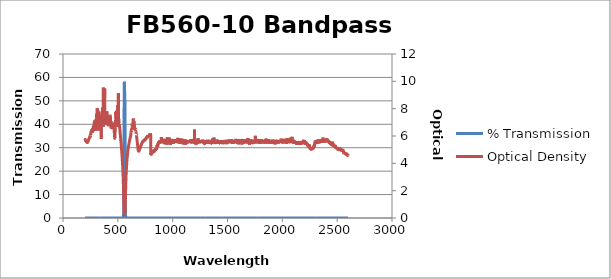
| Category | % Transmission |
|---|---|
| 2600.0 | 0.003 |
| 2599.0 | 0.002 |
| 2598.0 | 0.002 |
| 2597.0 | 0.002 |
| 2596.0 | 0.003 |
| 2595.0 | 0.003 |
| 2594.0 | 0.002 |
| 2593.0 | 0.003 |
| 2592.0 | 0.002 |
| 2591.0 | 0.002 |
| 2590.0 | 0.002 |
| 2589.0 | 0.002 |
| 2588.0 | 0.002 |
| 2587.0 | 0.002 |
| 2586.0 | 0.002 |
| 2585.0 | 0.002 |
| 2584.0 | 0.002 |
| 2583.0 | 0.002 |
| 2582.0 | 0.002 |
| 2581.0 | 0.002 |
| 2580.0 | 0.002 |
| 2579.0 | 0.002 |
| 2578.0 | 0.002 |
| 2577.0 | 0.002 |
| 2576.0 | 0.002 |
| 2575.0 | 0.002 |
| 2574.0 | 0.002 |
| 2573.0 | 0.002 |
| 2572.0 | 0.002 |
| 2571.0 | 0.002 |
| 2570.0 | 0.002 |
| 2569.0 | 0.002 |
| 2568.0 | 0.002 |
| 2567.0 | 0.002 |
| 2566.0 | 0.002 |
| 2565.0 | 0.002 |
| 2564.0 | 0.002 |
| 2563.0 | 0.002 |
| 2562.0 | 0.002 |
| 2561.0 | 0.002 |
| 2560.0 | 0.002 |
| 2559.0 | 0.001 |
| 2558.0 | 0.001 |
| 2557.0 | 0.001 |
| 2556.0 | 0.001 |
| 2555.0 | 0.001 |
| 2554.0 | 0.001 |
| 2553.0 | 0.001 |
| 2552.0 | 0.001 |
| 2551.0 | 0.001 |
| 2550.0 | 0.001 |
| 2549.0 | 0.001 |
| 2548.0 | 0.001 |
| 2547.0 | 0.001 |
| 2546.0 | 0.001 |
| 2545.0 | 0.001 |
| 2544.0 | 0.001 |
| 2543.0 | 0.001 |
| 2542.0 | 0.001 |
| 2541.0 | 0.001 |
| 2540.0 | 0.001 |
| 2539.0 | 0.001 |
| 2538.0 | 0.001 |
| 2537.0 | 0.001 |
| 2536.0 | 0.001 |
| 2535.0 | 0.001 |
| 2534.0 | 0.001 |
| 2533.0 | 0.001 |
| 2532.0 | 0.001 |
| 2531.0 | 0.001 |
| 2530.0 | 0.001 |
| 2529.0 | 0.001 |
| 2528.0 | 0.001 |
| 2527.0 | 0.001 |
| 2526.0 | 0.001 |
| 2525.0 | 0.001 |
| 2524.0 | 0.001 |
| 2523.0 | 0.001 |
| 2522.0 | 0.001 |
| 2521.0 | 0.001 |
| 2520.0 | 0.001 |
| 2519.0 | 0.001 |
| 2518.0 | 0.001 |
| 2517.0 | 0.001 |
| 2516.0 | 0.001 |
| 2515.0 | 0.001 |
| 2514.0 | 0.001 |
| 2513.0 | 0.001 |
| 2512.0 | 0.001 |
| 2511.0 | 0.001 |
| 2510.0 | 0.001 |
| 2509.0 | 0.001 |
| 2508.0 | 0.001 |
| 2507.0 | 0.001 |
| 2506.0 | 0.001 |
| 2505.0 | 0.001 |
| 2504.0 | 0.001 |
| 2503.0 | 0.001 |
| 2502.0 | 0.001 |
| 2501.0 | 0.001 |
| 2500.0 | 0.001 |
| 2499.0 | 0.001 |
| 2498.0 | 0.001 |
| 2497.0 | 0.001 |
| 2496.0 | 0.001 |
| 2495.0 | 0.001 |
| 2494.0 | 0.001 |
| 2493.0 | 0.001 |
| 2492.0 | 0.001 |
| 2491.0 | 0.001 |
| 2490.0 | 0.001 |
| 2489.0 | 0.001 |
| 2488.0 | 0.001 |
| 2487.0 | 0.001 |
| 2486.0 | 0.001 |
| 2485.0 | 0.001 |
| 2484.0 | 0.001 |
| 2483.0 | 0.001 |
| 2482.0 | 0.001 |
| 2481.0 | 0.001 |
| 2480.0 | 0 |
| 2479.0 | 0.001 |
| 2478.0 | 0.001 |
| 2477.0 | 0 |
| 2476.0 | 0.001 |
| 2475.0 | 0.001 |
| 2474.0 | 0.001 |
| 2473.0 | 0.001 |
| 2472.0 | 0.001 |
| 2471.0 | 0.001 |
| 2470.0 | 0.001 |
| 2469.0 | 0.001 |
| 2468.0 | 0 |
| 2467.0 | 0 |
| 2466.0 | 0.001 |
| 2465.0 | 0.001 |
| 2464.0 | 0 |
| 2463.0 | 0.001 |
| 2462.0 | 0.001 |
| 2461.0 | 0 |
| 2460.0 | 0 |
| 2459.0 | 0 |
| 2458.0 | 0 |
| 2457.0 | 0 |
| 2456.0 | 0 |
| 2455.0 | 0 |
| 2454.0 | 0 |
| 2453.0 | 0.001 |
| 2452.0 | 0 |
| 2451.0 | 0 |
| 2450.0 | 0 |
| 2449.0 | 0 |
| 2448.0 | 0 |
| 2447.0 | 0 |
| 2446.0 | 0 |
| 2445.0 | 0 |
| 2444.0 | 0 |
| 2443.0 | 0 |
| 2442.0 | 0 |
| 2441.0 | 0 |
| 2440.0 | 0 |
| 2439.0 | 0 |
| 2438.0 | 0 |
| 2437.0 | 0 |
| 2436.0 | 0 |
| 2435.0 | 0 |
| 2434.0 | 0 |
| 2433.0 | 0 |
| 2432.0 | 0 |
| 2431.0 | 0 |
| 2430.0 | 0 |
| 2429.0 | 0 |
| 2428.0 | 0 |
| 2427.0 | 0 |
| 2426.0 | 0 |
| 2425.0 | 0 |
| 2424.0 | 0 |
| 2423.0 | 0 |
| 2422.0 | 0 |
| 2421.0 | 0 |
| 2420.0 | 0 |
| 2419.0 | 0 |
| 2418.0 | 0 |
| 2417.0 | 0 |
| 2416.0 | 0 |
| 2415.0 | 0 |
| 2414.0 | 0 |
| 2413.0 | 0 |
| 2412.0 | 0 |
| 2411.0 | 0 |
| 2410.0 | 0 |
| 2409.0 | 0 |
| 2408.0 | 0 |
| 2407.0 | 0 |
| 2406.0 | 0 |
| 2405.0 | 0 |
| 2404.0 | 0 |
| 2403.0 | 0 |
| 2402.0 | 0 |
| 2401.0 | 0 |
| 2400.0 | 0 |
| 2399.0 | 0 |
| 2398.0 | 0 |
| 2397.0 | 0 |
| 2396.0 | 0 |
| 2395.0 | 0 |
| 2394.0 | 0 |
| 2393.0 | 0 |
| 2392.0 | 0 |
| 2391.0 | 0 |
| 2390.0 | 0 |
| 2389.0 | 0 |
| 2388.0 | 0 |
| 2387.0 | 0 |
| 2386.0 | 0 |
| 2385.0 | 0 |
| 2384.0 | 0 |
| 2383.0 | 0 |
| 2382.0 | 0 |
| 2381.0 | 0 |
| 2380.0 | 0 |
| 2379.0 | 0 |
| 2378.0 | 0 |
| 2377.0 | 0 |
| 2376.0 | 0 |
| 2375.0 | 0 |
| 2374.0 | 0 |
| 2373.0 | 0 |
| 2372.0 | 0 |
| 2371.0 | 0 |
| 2370.0 | 0 |
| 2369.0 | 0 |
| 2368.0 | 0 |
| 2367.0 | 0 |
| 2366.0 | 0 |
| 2365.0 | 0 |
| 2364.0 | 0 |
| 2363.0 | 0 |
| 2362.0 | 0 |
| 2361.0 | 0 |
| 2360.0 | 0 |
| 2359.0 | 0 |
| 2358.0 | 0 |
| 2357.0 | 0 |
| 2356.0 | 0 |
| 2355.0 | 0 |
| 2354.0 | 0 |
| 2353.0 | 0 |
| 2352.0 | 0 |
| 2351.0 | 0 |
| 2350.0 | 0 |
| 2349.0 | 0 |
| 2348.0 | 0 |
| 2347.0 | 0 |
| 2346.0 | 0 |
| 2345.0 | 0 |
| 2344.0 | 0 |
| 2343.0 | 0 |
| 2342.0 | 0 |
| 2341.0 | 0 |
| 2340.0 | 0 |
| 2339.0 | 0 |
| 2338.0 | 0 |
| 2337.0 | 0 |
| 2336.0 | 0 |
| 2335.0 | 0 |
| 2334.0 | 0 |
| 2333.0 | 0 |
| 2332.0 | 0 |
| 2331.0 | 0 |
| 2330.0 | 0 |
| 2329.0 | 0 |
| 2328.0 | 0 |
| 2327.0 | 0 |
| 2326.0 | 0 |
| 2325.0 | 0 |
| 2324.0 | 0 |
| 2323.0 | 0 |
| 2322.0 | 0 |
| 2321.0 | 0 |
| 2320.0 | 0 |
| 2319.0 | 0 |
| 2318.0 | 0 |
| 2317.0 | 0 |
| 2316.0 | 0 |
| 2315.0 | 0 |
| 2314.0 | 0 |
| 2313.0 | 0 |
| 2312.0 | 0 |
| 2311.0 | 0 |
| 2310.0 | 0 |
| 2309.0 | 0 |
| 2308.0 | 0 |
| 2307.0 | 0 |
| 2306.0 | 0 |
| 2305.0 | 0 |
| 2304.0 | 0 |
| 2303.0 | 0 |
| 2302.0 | 0 |
| 2301.0 | 0 |
| 2300.0 | 0 |
| 2299.0 | 0 |
| 2298.0 | 0 |
| 2297.0 | 0 |
| 2296.0 | 0 |
| 2295.0 | 0 |
| 2294.0 | 0.001 |
| 2293.0 | 0.001 |
| 2292.0 | 0.001 |
| 2291.0 | 0 |
| 2290.0 | 0 |
| 2289.0 | 0.001 |
| 2288.0 | 0.001 |
| 2287.0 | 0.001 |
| 2286.0 | 0.001 |
| 2285.0 | 0.001 |
| 2284.0 | 0.001 |
| 2283.0 | 0.001 |
| 2282.0 | 0.001 |
| 2281.0 | 0.001 |
| 2280.0 | 0.001 |
| 2279.0 | 0.001 |
| 2278.0 | 0.001 |
| 2277.0 | 0.001 |
| 2276.0 | 0.001 |
| 2275.0 | 0.001 |
| 2274.0 | 0.001 |
| 2273.0 | 0.001 |
| 2272.0 | 0.001 |
| 2271.0 | 0.001 |
| 2270.0 | 0.001 |
| 2269.0 | 0.001 |
| 2268.0 | 0.001 |
| 2267.0 | 0.001 |
| 2266.0 | 0.001 |
| 2265.0 | 0.001 |
| 2264.0 | 0.001 |
| 2263.0 | 0.001 |
| 2262.0 | 0.001 |
| 2261.0 | 0.001 |
| 2260.0 | 0.001 |
| 2259.0 | 0.001 |
| 2258.0 | 0.001 |
| 2257.0 | 0.001 |
| 2256.0 | 0.001 |
| 2255.0 | 0.001 |
| 2254.0 | 0.001 |
| 2253.0 | 0.001 |
| 2252.0 | 0.001 |
| 2251.0 | 0.001 |
| 2250.0 | 0.001 |
| 2249.0 | 0.001 |
| 2248.0 | 0.001 |
| 2247.0 | 0 |
| 2246.0 | 0.001 |
| 2245.0 | 0.001 |
| 2244.0 | 0.001 |
| 2243.0 | 0.001 |
| 2242.0 | 0 |
| 2241.0 | 0 |
| 2240.0 | 0.001 |
| 2239.0 | 0.001 |
| 2238.0 | 0.001 |
| 2237.0 | 0.001 |
| 2236.0 | 0.001 |
| 2235.0 | 0.001 |
| 2234.0 | 0 |
| 2233.0 | 0.001 |
| 2232.0 | 0 |
| 2231.0 | 0 |
| 2230.0 | 0 |
| 2229.0 | 0 |
| 2228.0 | 0 |
| 2227.0 | 0 |
| 2226.0 | 0 |
| 2225.0 | 0 |
| 2224.0 | 0 |
| 2223.0 | 0 |
| 2222.0 | 0 |
| 2221.0 | 0 |
| 2220.0 | 0 |
| 2219.0 | 0 |
| 2218.0 | 0 |
| 2217.0 | 0 |
| 2216.0 | 0 |
| 2215.0 | 0 |
| 2214.0 | 0 |
| 2213.0 | 0 |
| 2212.0 | 0 |
| 2211.0 | 0 |
| 2210.0 | 0 |
| 2209.0 | 0 |
| 2208.0 | 0 |
| 2207.0 | 0 |
| 2206.0 | 0 |
| 2205.0 | 0 |
| 2204.0 | 0 |
| 2203.0 | 0 |
| 2202.0 | 0 |
| 2201.0 | 0 |
| 2200.0 | 0 |
| 2199.0 | 0 |
| 2198.0 | 0 |
| 2197.0 | 0 |
| 2196.0 | 0 |
| 2195.0 | 0 |
| 2194.0 | 0 |
| 2193.0 | 0 |
| 2192.0 | 0 |
| 2191.0 | 0 |
| 2190.0 | 0 |
| 2189.0 | 0 |
| 2188.0 | 0 |
| 2187.0 | 0 |
| 2186.0 | 0 |
| 2185.0 | 0 |
| 2184.0 | 0 |
| 2183.0 | 0 |
| 2182.0 | 0 |
| 2181.0 | 0 |
| 2180.0 | 0 |
| 2179.0 | 0 |
| 2178.0 | 0 |
| 2177.0 | 0 |
| 2176.0 | 0 |
| 2175.0 | 0 |
| 2174.0 | 0 |
| 2173.0 | 0 |
| 2172.0 | 0 |
| 2171.0 | 0 |
| 2170.0 | 0 |
| 2169.0 | 0 |
| 2168.0 | 0 |
| 2167.0 | 0 |
| 2166.0 | 0 |
| 2165.0 | 0 |
| 2164.0 | 0 |
| 2163.0 | 0 |
| 2162.0 | 0 |
| 2161.0 | 0 |
| 2160.0 | 0 |
| 2159.0 | 0 |
| 2158.0 | 0 |
| 2157.0 | 0 |
| 2156.0 | 0 |
| 2155.0 | 0 |
| 2154.0 | 0 |
| 2153.0 | 0 |
| 2152.0 | 0 |
| 2151.0 | 0 |
| 2150.0 | 0 |
| 2149.0 | 0 |
| 2148.0 | 0 |
| 2147.0 | 0 |
| 2146.0 | 0 |
| 2145.0 | 0 |
| 2144.0 | 0 |
| 2143.0 | 0 |
| 2142.0 | 0 |
| 2141.0 | 0 |
| 2140.0 | 0 |
| 2139.0 | 0 |
| 2138.0 | 0 |
| 2137.0 | 0 |
| 2136.0 | 0 |
| 2135.0 | 0 |
| 2134.0 | 0 |
| 2133.0 | 0 |
| 2132.0 | 0 |
| 2131.0 | 0 |
| 2130.0 | 0 |
| 2129.0 | 0 |
| 2128.0 | 0 |
| 2127.0 | 0 |
| 2126.0 | 0 |
| 2125.0 | 0 |
| 2124.0 | 0 |
| 2123.0 | 0 |
| 2122.0 | 0 |
| 2121.0 | 0 |
| 2120.0 | 0 |
| 2119.0 | 0 |
| 2118.0 | 0 |
| 2117.0 | 0 |
| 2116.0 | 0 |
| 2115.0 | 0 |
| 2114.0 | 0 |
| 2113.0 | 0 |
| 2112.0 | 0 |
| 2111.0 | 0 |
| 2110.0 | 0 |
| 2109.0 | 0 |
| 2108.0 | 0 |
| 2107.0 | 0 |
| 2106.0 | 0 |
| 2105.0 | 0 |
| 2104.0 | 0 |
| 2103.0 | 0 |
| 2102.0 | 0 |
| 2101.0 | 0 |
| 2100.0 | 0 |
| 2099.0 | 0 |
| 2098.0 | 0 |
| 2097.0 | 0 |
| 2096.0 | 0 |
| 2095.0 | 0 |
| 2094.0 | 0 |
| 2093.0 | 0 |
| 2092.0 | 0 |
| 2091.0 | 0 |
| 2090.0 | 0 |
| 2089.0 | 0 |
| 2088.0 | 0 |
| 2087.0 | 0 |
| 2086.0 | 0 |
| 2085.0 | 0 |
| 2084.0 | 0 |
| 2083.0 | 0 |
| 2082.0 | 0 |
| 2081.0 | 0 |
| 2080.0 | 0 |
| 2079.0 | 0 |
| 2078.0 | 0 |
| 2077.0 | 0 |
| 2076.0 | 0 |
| 2075.0 | 0 |
| 2074.0 | 0 |
| 2073.0 | 0 |
| 2072.0 | 0 |
| 2071.0 | 0 |
| 2070.0 | 0 |
| 2069.0 | 0 |
| 2068.0 | 0 |
| 2067.0 | 0 |
| 2066.0 | 0 |
| 2065.0 | 0 |
| 2064.0 | 0 |
| 2063.0 | 0 |
| 2062.0 | 0 |
| 2061.0 | 0 |
| 2060.0 | 0 |
| 2059.0 | 0 |
| 2058.0 | 0 |
| 2057.0 | 0 |
| 2056.0 | 0 |
| 2055.0 | 0 |
| 2054.0 | 0 |
| 2053.0 | 0 |
| 2052.0 | 0 |
| 2051.0 | 0 |
| 2050.0 | 0 |
| 2049.0 | 0 |
| 2048.0 | 0 |
| 2047.0 | 0 |
| 2046.0 | 0 |
| 2045.0 | 0 |
| 2044.0 | 0 |
| 2043.0 | 0 |
| 2042.0 | 0 |
| 2041.0 | 0 |
| 2040.0 | 0 |
| 2039.0 | 0 |
| 2038.0 | 0 |
| 2037.0 | 0 |
| 2036.0 | 0 |
| 2035.0 | 0 |
| 2034.0 | 0 |
| 2033.0 | 0 |
| 2032.0 | 0 |
| 2031.0 | 0 |
| 2030.0 | 0 |
| 2029.0 | 0 |
| 2028.0 | 0 |
| 2027.0 | 0 |
| 2026.0 | 0 |
| 2025.0 | 0 |
| 2024.0 | 0 |
| 2023.0 | 0 |
| 2022.0 | 0 |
| 2021.0 | 0 |
| 2020.0 | 0 |
| 2019.0 | 0 |
| 2018.0 | 0 |
| 2017.0 | 0 |
| 2016.0 | 0 |
| 2015.0 | 0 |
| 2014.0 | 0 |
| 2013.0 | 0 |
| 2012.0 | 0 |
| 2011.0 | 0 |
| 2010.0 | 0 |
| 2009.0 | 0 |
| 2008.0 | 0 |
| 2007.0 | 0 |
| 2006.0 | 0 |
| 2005.0 | 0 |
| 2004.0 | 0 |
| 2003.0 | 0 |
| 2002.0 | 0 |
| 2001.0 | 0 |
| 2000.0 | 0 |
| 1999.0 | 0 |
| 1998.0 | 0 |
| 1997.0 | 0 |
| 1996.0 | 0 |
| 1995.0 | 0 |
| 1994.0 | 0 |
| 1993.0 | 0 |
| 1992.0 | 0 |
| 1991.0 | 0 |
| 1990.0 | 0 |
| 1989.0 | 0 |
| 1988.0 | 0 |
| 1987.0 | 0 |
| 1986.0 | 0 |
| 1985.0 | 0 |
| 1984.0 | 0 |
| 1983.0 | 0 |
| 1982.0 | 0 |
| 1981.0 | 0 |
| 1980.0 | 0 |
| 1979.0 | 0 |
| 1978.0 | 0 |
| 1977.0 | 0 |
| 1976.0 | 0 |
| 1975.0 | 0 |
| 1974.0 | 0 |
| 1973.0 | 0 |
| 1972.0 | 0 |
| 1971.0 | 0 |
| 1970.0 | 0 |
| 1969.0 | 0 |
| 1968.0 | 0 |
| 1967.0 | 0 |
| 1966.0 | 0 |
| 1965.0 | 0 |
| 1964.0 | 0 |
| 1963.0 | 0 |
| 1962.0 | 0 |
| 1961.0 | 0 |
| 1960.0 | 0 |
| 1959.0 | 0 |
| 1958.0 | 0 |
| 1957.0 | 0 |
| 1956.0 | 0 |
| 1955.0 | 0 |
| 1954.0 | 0 |
| 1953.0 | 0 |
| 1952.0 | 0 |
| 1951.0 | 0 |
| 1950.0 | 0 |
| 1949.0 | 0 |
| 1948.0 | 0 |
| 1947.0 | 0 |
| 1946.0 | 0 |
| 1945.0 | 0 |
| 1944.0 | 0 |
| 1943.0 | 0 |
| 1942.0 | 0 |
| 1941.0 | 0 |
| 1940.0 | 0 |
| 1939.0 | 0 |
| 1938.0 | 0 |
| 1937.0 | 0 |
| 1936.0 | 0 |
| 1935.0 | 0 |
| 1934.0 | 0 |
| 1933.0 | 0 |
| 1932.0 | 0 |
| 1931.0 | 0 |
| 1930.0 | 0 |
| 1929.0 | 0 |
| 1928.0 | 0 |
| 1927.0 | 0 |
| 1926.0 | 0 |
| 1925.0 | 0 |
| 1924.0 | 0 |
| 1923.0 | 0 |
| 1922.0 | 0 |
| 1921.0 | 0 |
| 1920.0 | 0 |
| 1919.0 | 0 |
| 1918.0 | 0 |
| 1917.0 | 0 |
| 1916.0 | 0 |
| 1915.0 | 0 |
| 1914.0 | 0 |
| 1913.0 | 0 |
| 1912.0 | 0 |
| 1911.0 | 0 |
| 1910.0 | 0 |
| 1909.0 | 0 |
| 1908.0 | 0 |
| 1907.0 | 0 |
| 1906.0 | 0 |
| 1905.0 | 0 |
| 1904.0 | 0 |
| 1903.0 | 0 |
| 1902.0 | 0 |
| 1901.0 | 0 |
| 1900.0 | 0 |
| 1899.0 | 0 |
| 1898.0 | 0 |
| 1897.0 | 0 |
| 1896.0 | 0 |
| 1895.0 | 0 |
| 1894.0 | 0 |
| 1893.0 | 0 |
| 1892.0 | 0 |
| 1891.0 | 0 |
| 1890.0 | 0 |
| 1889.0 | 0 |
| 1888.0 | 0 |
| 1887.0 | 0 |
| 1886.0 | 0 |
| 1885.0 | 0 |
| 1884.0 | 0 |
| 1883.0 | 0 |
| 1882.0 | 0 |
| 1881.0 | 0 |
| 1880.0 | 0 |
| 1879.0 | 0 |
| 1878.0 | 0 |
| 1877.0 | 0 |
| 1876.0 | 0 |
| 1875.0 | 0 |
| 1874.0 | 0 |
| 1873.0 | 0 |
| 1872.0 | 0 |
| 1871.0 | 0 |
| 1870.0 | 0 |
| 1869.0 | 0 |
| 1868.0 | 0 |
| 1867.0 | 0 |
| 1866.0 | 0 |
| 1865.0 | 0 |
| 1864.0 | 0 |
| 1863.0 | 0 |
| 1862.0 | 0 |
| 1861.0 | 0 |
| 1860.0 | 0 |
| 1859.0 | 0 |
| 1858.0 | 0 |
| 1857.0 | 0 |
| 1856.0 | 0 |
| 1855.0 | 0 |
| 1854.0 | 0 |
| 1853.0 | 0 |
| 1852.0 | 0 |
| 1851.0 | 0 |
| 1850.0 | 0 |
| 1849.0 | 0 |
| 1848.0 | 0 |
| 1847.0 | 0 |
| 1846.0 | 0 |
| 1845.0 | 0 |
| 1844.0 | 0 |
| 1843.0 | 0 |
| 1842.0 | 0 |
| 1841.0 | 0 |
| 1840.0 | 0 |
| 1839.0 | 0 |
| 1838.0 | 0 |
| 1837.0 | 0 |
| 1836.0 | 0 |
| 1835.0 | 0 |
| 1834.0 | 0 |
| 1833.0 | 0 |
| 1832.0 | 0 |
| 1831.0 | 0 |
| 1830.0 | 0 |
| 1829.0 | 0 |
| 1828.0 | 0 |
| 1827.0 | 0 |
| 1826.0 | 0 |
| 1825.0 | 0 |
| 1824.0 | 0 |
| 1823.0 | 0 |
| 1822.0 | 0 |
| 1821.0 | 0 |
| 1820.0 | 0 |
| 1819.0 | 0 |
| 1818.0 | 0 |
| 1817.0 | 0 |
| 1816.0 | 0 |
| 1815.0 | 0 |
| 1814.0 | 0 |
| 1813.0 | 0 |
| 1812.0 | 0 |
| 1811.0 | 0 |
| 1810.0 | 0 |
| 1809.0 | 0 |
| 1808.0 | 0 |
| 1807.0 | 0 |
| 1806.0 | 0 |
| 1805.0 | 0 |
| 1804.0 | 0 |
| 1803.0 | 0 |
| 1802.0 | 0 |
| 1801.0 | 0 |
| 1800.0 | 0 |
| 1799.0 | 0 |
| 1798.0 | 0 |
| 1797.0 | 0 |
| 1796.0 | 0 |
| 1795.0 | 0 |
| 1794.0 | 0 |
| 1793.0 | 0 |
| 1792.0 | 0 |
| 1791.0 | 0 |
| 1790.0 | 0 |
| 1789.0 | 0 |
| 1788.0 | 0 |
| 1787.0 | 0 |
| 1786.0 | 0 |
| 1785.0 | 0 |
| 1784.0 | 0 |
| 1783.0 | 0 |
| 1782.0 | 0 |
| 1781.0 | 0 |
| 1780.0 | 0 |
| 1779.0 | 0 |
| 1778.0 | 0 |
| 1777.0 | 0 |
| 1776.0 | 0 |
| 1775.0 | 0 |
| 1774.0 | 0 |
| 1773.0 | 0 |
| 1772.0 | 0 |
| 1771.0 | 0 |
| 1770.0 | 0 |
| 1769.0 | 0 |
| 1768.0 | 0 |
| 1767.0 | 0 |
| 1766.0 | 0 |
| 1765.0 | 0 |
| 1764.0 | 0 |
| 1763.0 | 0 |
| 1762.0 | 0 |
| 1761.0 | 0 |
| 1760.0 | 0 |
| 1759.0 | 0 |
| 1758.0 | 0 |
| 1757.0 | 0 |
| 1756.0 | 0 |
| 1755.0 | 0 |
| 1754.0 | 0 |
| 1753.0 | 0 |
| 1752.0 | 0 |
| 1751.0 | 0 |
| 1750.0 | 0 |
| 1749.0 | 0 |
| 1748.0 | 0 |
| 1747.0 | 0 |
| 1746.0 | 0 |
| 1745.0 | 0 |
| 1744.0 | 0 |
| 1743.0 | 0 |
| 1742.0 | 0 |
| 1741.0 | 0 |
| 1740.0 | 0 |
| 1739.0 | 0 |
| 1738.0 | 0 |
| 1737.0 | 0 |
| 1736.0 | 0 |
| 1735.0 | 0 |
| 1734.0 | 0 |
| 1733.0 | 0 |
| 1732.0 | 0 |
| 1731.0 | 0 |
| 1730.0 | 0 |
| 1729.0 | 0 |
| 1728.0 | 0 |
| 1727.0 | 0 |
| 1726.0 | 0 |
| 1725.0 | 0 |
| 1724.0 | 0 |
| 1723.0 | 0 |
| 1722.0 | 0 |
| 1721.0 | 0 |
| 1720.0 | 0 |
| 1719.0 | 0 |
| 1718.0 | 0 |
| 1717.0 | 0 |
| 1716.0 | 0 |
| 1715.0 | 0 |
| 1714.0 | 0 |
| 1713.0 | 0 |
| 1712.0 | 0 |
| 1711.0 | 0 |
| 1710.0 | 0 |
| 1709.0 | 0 |
| 1708.0 | 0 |
| 1707.0 | 0 |
| 1706.0 | 0 |
| 1705.0 | 0 |
| 1704.0 | 0 |
| 1703.0 | 0 |
| 1702.0 | 0 |
| 1701.0 | 0 |
| 1700.0 | 0 |
| 1699.0 | 0 |
| 1698.0 | 0 |
| 1697.0 | 0 |
| 1696.0 | 0 |
| 1695.0 | 0 |
| 1694.0 | 0 |
| 1693.0 | 0 |
| 1692.0 | 0 |
| 1691.0 | 0 |
| 1690.0 | 0 |
| 1689.0 | 0 |
| 1688.0 | 0 |
| 1687.0 | 0 |
| 1686.0 | 0 |
| 1685.0 | 0 |
| 1684.0 | 0 |
| 1683.0 | 0 |
| 1682.0 | 0 |
| 1681.0 | 0 |
| 1680.0 | 0 |
| 1679.0 | 0 |
| 1678.0 | 0 |
| 1677.0 | 0 |
| 1676.0 | 0 |
| 1675.0 | 0 |
| 1674.0 | 0 |
| 1673.0 | 0 |
| 1672.0 | 0 |
| 1671.0 | 0 |
| 1670.0 | 0 |
| 1669.0 | 0 |
| 1668.0 | 0 |
| 1667.0 | 0 |
| 1666.0 | 0 |
| 1665.0 | 0 |
| 1664.0 | 0 |
| 1663.0 | 0 |
| 1662.0 | 0 |
| 1661.0 | 0 |
| 1660.0 | 0 |
| 1659.0 | 0 |
| 1658.0 | 0 |
| 1657.0 | 0 |
| 1656.0 | 0 |
| 1655.0 | 0 |
| 1654.0 | 0 |
| 1653.0 | 0 |
| 1652.0 | 0 |
| 1651.0 | 0 |
| 1650.0 | 0 |
| 1649.0 | 0 |
| 1648.0 | 0 |
| 1647.0 | 0 |
| 1646.0 | 0 |
| 1645.0 | 0 |
| 1644.0 | 0 |
| 1643.0 | 0 |
| 1642.0 | 0 |
| 1641.0 | 0 |
| 1640.0 | 0 |
| 1639.0 | 0 |
| 1638.0 | 0 |
| 1637.0 | 0 |
| 1636.0 | 0 |
| 1635.0 | 0 |
| 1634.0 | 0 |
| 1633.0 | 0 |
| 1632.0 | 0 |
| 1631.0 | 0 |
| 1630.0 | 0 |
| 1629.0 | 0 |
| 1628.0 | 0 |
| 1627.0 | 0 |
| 1626.0 | 0 |
| 1625.0 | 0 |
| 1624.0 | 0 |
| 1623.0 | 0 |
| 1622.0 | 0 |
| 1621.0 | 0 |
| 1620.0 | 0 |
| 1619.0 | 0 |
| 1618.0 | 0 |
| 1617.0 | 0 |
| 1616.0 | 0 |
| 1615.0 | 0 |
| 1614.0 | 0 |
| 1613.0 | 0 |
| 1612.0 | 0 |
| 1611.0 | 0 |
| 1610.0 | 0 |
| 1609.0 | 0 |
| 1608.0 | 0 |
| 1607.0 | 0 |
| 1606.0 | 0 |
| 1605.0 | 0 |
| 1604.0 | 0 |
| 1603.0 | 0 |
| 1602.0 | 0 |
| 1601.0 | 0 |
| 1600.0 | 0 |
| 1599.0 | 0 |
| 1598.0 | 0 |
| 1597.0 | 0 |
| 1596.0 | 0 |
| 1595.0 | 0 |
| 1594.0 | 0 |
| 1593.0 | 0 |
| 1592.0 | 0 |
| 1591.0 | 0 |
| 1590.0 | 0 |
| 1589.0 | 0 |
| 1588.0 | 0 |
| 1587.0 | 0 |
| 1586.0 | 0 |
| 1585.0 | 0 |
| 1584.0 | 0 |
| 1583.0 | 0 |
| 1582.0 | 0 |
| 1581.0 | 0 |
| 1580.0 | 0 |
| 1579.0 | 0 |
| 1578.0 | 0 |
| 1577.0 | 0 |
| 1576.0 | 0 |
| 1575.0 | 0 |
| 1574.0 | 0 |
| 1573.0 | 0 |
| 1572.0 | 0 |
| 1571.0 | 0 |
| 1570.0 | 0 |
| 1569.0 | 0 |
| 1568.0 | 0 |
| 1567.0 | 0 |
| 1566.0 | 0 |
| 1565.0 | 0 |
| 1564.0 | 0 |
| 1563.0 | 0 |
| 1562.0 | 0 |
| 1561.0 | 0 |
| 1560.0 | 0 |
| 1559.0 | 0 |
| 1558.0 | 0 |
| 1557.0 | 0 |
| 1556.0 | 0 |
| 1555.0 | 0 |
| 1554.0 | 0 |
| 1553.0 | 0 |
| 1552.0 | 0 |
| 1551.0 | 0 |
| 1550.0 | 0 |
| 1549.0 | 0 |
| 1548.0 | 0 |
| 1547.0 | 0 |
| 1546.0 | 0 |
| 1545.0 | 0 |
| 1544.0 | 0 |
| 1543.0 | 0 |
| 1542.0 | 0 |
| 1541.0 | 0 |
| 1540.0 | 0 |
| 1539.0 | 0 |
| 1538.0 | 0 |
| 1537.0 | 0 |
| 1536.0 | 0 |
| 1535.0 | 0 |
| 1534.0 | 0 |
| 1533.0 | 0 |
| 1532.0 | 0 |
| 1531.0 | 0 |
| 1530.0 | 0 |
| 1529.0 | 0 |
| 1528.0 | 0 |
| 1527.0 | 0 |
| 1526.0 | 0 |
| 1525.0 | 0 |
| 1524.0 | 0 |
| 1523.0 | 0 |
| 1522.0 | 0 |
| 1521.0 | 0 |
| 1520.0 | 0 |
| 1519.0 | 0 |
| 1518.0 | 0 |
| 1517.0 | 0 |
| 1516.0 | 0 |
| 1515.0 | 0 |
| 1514.0 | 0 |
| 1513.0 | 0 |
| 1512.0 | 0 |
| 1511.0 | 0 |
| 1510.0 | 0 |
| 1509.0 | 0 |
| 1508.0 | 0 |
| 1507.0 | 0 |
| 1506.0 | 0 |
| 1505.0 | 0 |
| 1504.0 | 0 |
| 1503.0 | 0 |
| 1502.0 | 0 |
| 1501.0 | 0 |
| 1500.0 | 0 |
| 1499.0 | 0 |
| 1498.0 | 0 |
| 1497.0 | 0 |
| 1496.0 | 0 |
| 1495.0 | 0 |
| 1494.0 | 0 |
| 1493.0 | 0 |
| 1492.0 | 0 |
| 1491.0 | 0 |
| 1490.0 | 0 |
| 1489.0 | 0 |
| 1488.0 | 0 |
| 1487.0 | 0 |
| 1486.0 | 0 |
| 1485.0 | 0 |
| 1484.0 | 0 |
| 1483.0 | 0 |
| 1482.0 | 0 |
| 1481.0 | 0 |
| 1480.0 | 0 |
| 1479.0 | 0 |
| 1478.0 | 0 |
| 1477.0 | 0 |
| 1476.0 | 0 |
| 1475.0 | 0 |
| 1474.0 | 0 |
| 1473.0 | 0 |
| 1472.0 | 0 |
| 1471.0 | 0 |
| 1470.0 | 0 |
| 1469.0 | 0 |
| 1468.0 | 0 |
| 1467.0 | 0 |
| 1466.0 | 0 |
| 1465.0 | 0 |
| 1464.0 | 0 |
| 1463.0 | 0 |
| 1462.0 | 0 |
| 1461.0 | 0 |
| 1460.0 | 0 |
| 1459.0 | 0 |
| 1458.0 | 0 |
| 1457.0 | 0 |
| 1456.0 | 0 |
| 1455.0 | 0 |
| 1454.0 | 0 |
| 1453.0 | 0 |
| 1452.0 | 0 |
| 1451.0 | 0 |
| 1450.0 | 0 |
| 1449.0 | 0 |
| 1448.0 | 0 |
| 1447.0 | 0 |
| 1446.0 | 0 |
| 1445.0 | 0 |
| 1444.0 | 0 |
| 1443.0 | 0 |
| 1442.0 | 0 |
| 1441.0 | 0 |
| 1440.0 | 0 |
| 1439.0 | 0 |
| 1438.0 | 0 |
| 1437.0 | 0 |
| 1436.0 | 0 |
| 1435.0 | 0 |
| 1434.0 | 0 |
| 1433.0 | 0 |
| 1432.0 | 0 |
| 1431.0 | 0 |
| 1430.0 | 0 |
| 1429.0 | 0 |
| 1428.0 | 0 |
| 1427.0 | 0 |
| 1426.0 | 0 |
| 1425.0 | 0 |
| 1424.0 | 0 |
| 1423.0 | 0 |
| 1422.0 | 0 |
| 1421.0 | 0 |
| 1420.0 | 0 |
| 1419.0 | 0 |
| 1418.0 | 0 |
| 1417.0 | 0 |
| 1416.0 | 0 |
| 1415.0 | 0 |
| 1414.0 | 0 |
| 1413.0 | 0 |
| 1412.0 | 0 |
| 1411.0 | 0 |
| 1410.0 | 0 |
| 1409.0 | 0 |
| 1408.0 | 0 |
| 1407.0 | 0 |
| 1406.0 | 0 |
| 1405.0 | 0 |
| 1404.0 | 0 |
| 1403.0 | 0 |
| 1402.0 | 0 |
| 1401.0 | 0 |
| 1400.0 | 0 |
| 1399.0 | 0 |
| 1398.0 | 0 |
| 1397.0 | 0 |
| 1396.0 | 0 |
| 1395.0 | 0 |
| 1394.0 | 0 |
| 1393.0 | 0 |
| 1392.0 | 0 |
| 1391.0 | 0 |
| 1390.0 | 0 |
| 1389.0 | 0 |
| 1388.0 | 0 |
| 1387.0 | 0 |
| 1386.0 | 0 |
| 1385.0 | 0 |
| 1384.0 | 0 |
| 1383.0 | 0 |
| 1382.0 | 0 |
| 1381.0 | 0 |
| 1380.0 | 0 |
| 1379.0 | 0 |
| 1378.0 | 0 |
| 1377.0 | 0 |
| 1376.0 | 0 |
| 1375.0 | 0 |
| 1374.0 | 0 |
| 1373.0 | 0 |
| 1372.0 | 0 |
| 1371.0 | 0 |
| 1370.0 | 0 |
| 1369.0 | 0 |
| 1368.0 | 0 |
| 1367.0 | 0 |
| 1366.0 | 0 |
| 1365.0 | 0 |
| 1364.0 | 0 |
| 1363.0 | 0 |
| 1362.0 | 0 |
| 1361.0 | 0 |
| 1360.0 | 0 |
| 1359.0 | 0 |
| 1358.0 | 0 |
| 1357.0 | 0 |
| 1356.0 | 0 |
| 1355.0 | 0 |
| 1354.0 | 0 |
| 1353.0 | 0 |
| 1352.0 | 0 |
| 1351.0 | 0 |
| 1350.0 | 0 |
| 1349.0 | 0 |
| 1348.0 | 0 |
| 1347.0 | 0 |
| 1346.0 | 0 |
| 1345.0 | 0 |
| 1344.0 | 0 |
| 1343.0 | 0 |
| 1342.0 | 0 |
| 1341.0 | 0 |
| 1340.0 | 0 |
| 1339.0 | 0 |
| 1338.0 | 0 |
| 1337.0 | 0 |
| 1336.0 | 0 |
| 1335.0 | 0 |
| 1334.0 | 0 |
| 1333.0 | 0 |
| 1332.0 | 0 |
| 1331.0 | 0 |
| 1330.0 | 0 |
| 1329.0 | 0 |
| 1328.0 | 0 |
| 1327.0 | 0 |
| 1326.0 | 0 |
| 1325.0 | 0 |
| 1324.0 | 0 |
| 1323.0 | 0 |
| 1322.0 | 0 |
| 1321.0 | 0 |
| 1320.0 | 0 |
| 1319.0 | 0 |
| 1318.0 | 0 |
| 1317.0 | 0 |
| 1316.0 | 0 |
| 1315.0 | 0 |
| 1314.0 | 0 |
| 1313.0 | 0 |
| 1312.0 | 0 |
| 1311.0 | 0 |
| 1310.0 | 0 |
| 1309.0 | 0 |
| 1308.0 | 0 |
| 1307.0 | 0 |
| 1306.0 | 0 |
| 1305.0 | 0 |
| 1304.0 | 0 |
| 1303.0 | 0 |
| 1302.0 | 0 |
| 1301.0 | 0 |
| 1300.0 | 0 |
| 1299.0 | 0 |
| 1298.0 | 0 |
| 1297.0 | 0 |
| 1296.0 | 0 |
| 1295.0 | 0 |
| 1294.0 | 0 |
| 1293.0 | 0 |
| 1292.0 | 0 |
| 1291.0 | 0 |
| 1290.0 | 0 |
| 1289.0 | 0 |
| 1288.0 | 0 |
| 1287.0 | 0 |
| 1286.0 | 0 |
| 1285.0 | 0 |
| 1284.0 | 0 |
| 1283.0 | 0 |
| 1282.0 | 0 |
| 1281.0 | 0 |
| 1280.0 | 0 |
| 1279.0 | 0 |
| 1278.0 | 0 |
| 1277.0 | 0 |
| 1276.0 | 0 |
| 1275.0 | 0 |
| 1274.0 | 0 |
| 1273.0 | 0 |
| 1272.0 | 0 |
| 1271.0 | 0 |
| 1270.0 | 0 |
| 1269.0 | 0 |
| 1268.0 | 0 |
| 1267.0 | 0 |
| 1266.0 | 0 |
| 1265.0 | 0 |
| 1264.0 | 0 |
| 1263.0 | 0 |
| 1262.0 | 0 |
| 1261.0 | 0 |
| 1260.0 | 0 |
| 1259.0 | 0 |
| 1258.0 | 0 |
| 1257.0 | 0 |
| 1256.0 | 0 |
| 1255.0 | 0 |
| 1254.0 | 0 |
| 1253.0 | 0 |
| 1252.0 | 0 |
| 1251.0 | 0 |
| 1250.0 | 0 |
| 1249.0 | 0 |
| 1248.0 | 0 |
| 1247.0 | 0 |
| 1246.0 | 0 |
| 1245.0 | 0 |
| 1244.0 | 0 |
| 1243.0 | 0 |
| 1242.0 | 0 |
| 1241.0 | 0 |
| 1240.0 | 0 |
| 1239.0 | 0 |
| 1238.0 | 0 |
| 1237.0 | 0 |
| 1236.0 | 0 |
| 1235.0 | 0 |
| 1234.0 | 0 |
| 1233.0 | 0 |
| 1232.0 | 0 |
| 1231.0 | 0 |
| 1230.0 | 0 |
| 1229.0 | 0 |
| 1228.0 | 0 |
| 1227.0 | 0 |
| 1226.0 | 0 |
| 1225.0 | 0 |
| 1224.0 | 0 |
| 1223.0 | 0 |
| 1222.0 | 0 |
| 1221.0 | 0 |
| 1220.0 | 0 |
| 1219.0 | 0 |
| 1218.0 | 0 |
| 1217.0 | 0 |
| 1216.0 | 0 |
| 1215.0 | 0 |
| 1214.0 | 0 |
| 1213.0 | 0 |
| 1212.0 | 0 |
| 1211.0 | 0 |
| 1210.0 | 0 |
| 1209.0 | 0 |
| 1208.0 | 0 |
| 1207.0 | 0 |
| 1206.0 | 0 |
| 1205.0 | 0 |
| 1204.0 | 0 |
| 1203.0 | 0 |
| 1202.0 | 0 |
| 1201.0 | 0 |
| 1200.0 | 0 |
| 1199.0 | 0 |
| 1198.0 | 0 |
| 1197.0 | 0 |
| 1196.0 | 0 |
| 1195.0 | 0 |
| 1194.0 | 0 |
| 1193.0 | 0 |
| 1192.0 | 0 |
| 1191.0 | 0 |
| 1190.0 | 0 |
| 1189.0 | 0 |
| 1188.0 | 0 |
| 1187.0 | 0 |
| 1186.0 | 0 |
| 1185.0 | 0 |
| 1184.0 | 0 |
| 1183.0 | 0 |
| 1182.0 | 0 |
| 1181.0 | 0 |
| 1180.0 | 0 |
| 1179.0 | 0 |
| 1178.0 | 0 |
| 1177.0 | 0 |
| 1176.0 | 0 |
| 1175.0 | 0 |
| 1174.0 | 0 |
| 1173.0 | 0 |
| 1172.0 | 0 |
| 1171.0 | 0 |
| 1170.0 | 0 |
| 1169.0 | 0 |
| 1168.0 | 0 |
| 1167.0 | 0 |
| 1166.0 | 0 |
| 1165.0 | 0 |
| 1164.0 | 0 |
| 1163.0 | 0 |
| 1162.0 | 0 |
| 1161.0 | 0 |
| 1160.0 | 0 |
| 1159.0 | 0 |
| 1158.0 | 0 |
| 1157.0 | 0 |
| 1156.0 | 0 |
| 1155.0 | 0 |
| 1154.0 | 0 |
| 1153.0 | 0 |
| 1152.0 | 0 |
| 1151.0 | 0 |
| 1150.0 | 0 |
| 1149.0 | 0 |
| 1148.0 | 0 |
| 1147.0 | 0 |
| 1146.0 | 0 |
| 1145.0 | 0 |
| 1144.0 | 0 |
| 1143.0 | 0 |
| 1142.0 | 0 |
| 1141.0 | 0 |
| 1140.0 | 0 |
| 1139.0 | 0 |
| 1138.0 | 0 |
| 1137.0 | 0 |
| 1136.0 | 0 |
| 1135.0 | 0 |
| 1134.0 | 0 |
| 1133.0 | 0 |
| 1132.0 | 0 |
| 1131.0 | 0 |
| 1130.0 | 0 |
| 1129.0 | 0 |
| 1128.0 | 0 |
| 1127.0 | 0 |
| 1126.0 | 0 |
| 1125.0 | 0 |
| 1124.0 | 0 |
| 1123.0 | 0 |
| 1122.0 | 0 |
| 1121.0 | 0 |
| 1120.0 | 0 |
| 1119.0 | 0 |
| 1118.0 | 0 |
| 1117.0 | 0 |
| 1116.0 | 0 |
| 1115.0 | 0 |
| 1114.0 | 0 |
| 1113.0 | 0 |
| 1112.0 | 0 |
| 1111.0 | 0 |
| 1110.0 | 0 |
| 1109.0 | 0 |
| 1108.0 | 0 |
| 1107.0 | 0 |
| 1106.0 | 0 |
| 1105.0 | 0 |
| 1104.0 | 0 |
| 1103.0 | 0 |
| 1102.0 | 0 |
| 1101.0 | 0 |
| 1100.0 | 0 |
| 1099.0 | 0 |
| 1098.0 | 0 |
| 1097.0 | 0 |
| 1096.0 | 0 |
| 1095.0 | 0 |
| 1094.0 | 0 |
| 1093.0 | 0 |
| 1092.0 | 0 |
| 1091.0 | 0 |
| 1090.0 | 0 |
| 1089.0 | 0 |
| 1088.0 | 0 |
| 1087.0 | 0 |
| 1086.0 | 0 |
| 1085.0 | 0 |
| 1084.0 | 0 |
| 1083.0 | 0 |
| 1082.0 | 0 |
| 1081.0 | 0 |
| 1080.0 | 0 |
| 1079.0 | 0 |
| 1078.0 | 0 |
| 1077.0 | 0 |
| 1076.0 | 0 |
| 1075.0 | 0 |
| 1074.0 | 0 |
| 1073.0 | 0 |
| 1072.0 | 0 |
| 1071.0 | 0 |
| 1070.0 | 0 |
| 1069.0 | 0 |
| 1068.0 | 0 |
| 1067.0 | 0 |
| 1066.0 | 0 |
| 1065.0 | 0 |
| 1064.0 | 0 |
| 1063.0 | 0 |
| 1062.0 | 0 |
| 1061.0 | 0 |
| 1060.0 | 0 |
| 1059.0 | 0 |
| 1058.0 | 0 |
| 1057.0 | 0 |
| 1056.0 | 0 |
| 1055.0 | 0 |
| 1054.0 | 0 |
| 1053.0 | 0 |
| 1052.0 | 0 |
| 1051.0 | 0 |
| 1050.0 | 0 |
| 1049.0 | 0 |
| 1048.0 | 0 |
| 1047.0 | 0 |
| 1046.0 | 0 |
| 1045.0 | 0 |
| 1044.0 | 0 |
| 1043.0 | 0 |
| 1042.0 | 0 |
| 1041.0 | 0 |
| 1040.0 | 0 |
| 1039.0 | 0 |
| 1038.0 | 0 |
| 1037.0 | 0 |
| 1036.0 | 0 |
| 1035.0 | 0 |
| 1034.0 | 0 |
| 1033.0 | 0 |
| 1032.0 | 0 |
| 1031.0 | 0 |
| 1030.0 | 0 |
| 1029.0 | 0 |
| 1028.0 | 0 |
| 1027.0 | 0 |
| 1026.0 | 0 |
| 1025.0 | 0 |
| 1024.0 | 0 |
| 1023.0 | 0 |
| 1022.0 | 0 |
| 1021.0 | 0 |
| 1020.0 | 0 |
| 1019.0 | 0 |
| 1018.0 | 0 |
| 1017.0 | 0 |
| 1016.0 | 0 |
| 1015.0 | 0 |
| 1014.0 | 0 |
| 1013.0 | 0 |
| 1012.0 | 0 |
| 1011.0 | 0 |
| 1010.0 | 0 |
| 1009.0 | 0 |
| 1008.0 | 0 |
| 1007.0 | 0 |
| 1006.0 | 0 |
| 1005.0 | 0 |
| 1004.0 | 0 |
| 1003.0 | 0 |
| 1002.0 | 0 |
| 1001.0 | 0 |
| 1000.0 | 0 |
| 999.0 | 0 |
| 998.0 | 0 |
| 997.0 | 0 |
| 996.0 | 0 |
| 995.0 | 0 |
| 994.0 | 0 |
| 993.0 | 0 |
| 992.0 | 0 |
| 991.0 | 0 |
| 990.0 | 0 |
| 989.0 | 0 |
| 988.0 | 0 |
| 987.0 | 0 |
| 986.0 | 0 |
| 985.0 | 0 |
| 984.0 | 0 |
| 983.0 | 0 |
| 982.0 | 0 |
| 981.0 | 0 |
| 980.0 | 0 |
| 979.0 | 0 |
| 978.0 | 0 |
| 977.0 | 0 |
| 976.0 | 0 |
| 975.0 | 0 |
| 974.0 | 0 |
| 973.0 | 0 |
| 972.0 | 0 |
| 971.0 | 0 |
| 970.0 | 0 |
| 969.0 | 0 |
| 968.0 | 0 |
| 967.0 | 0 |
| 966.0 | 0 |
| 965.0 | 0 |
| 964.0 | 0 |
| 963.0 | 0 |
| 962.0 | 0 |
| 961.0 | 0 |
| 960.0 | 0 |
| 959.0 | 0 |
| 958.0 | 0 |
| 957.0 | 0 |
| 956.0 | 0 |
| 955.0 | 0 |
| 954.0 | 0 |
| 953.0 | 0 |
| 952.0 | 0 |
| 951.0 | 0 |
| 950.0 | 0 |
| 949.0 | 0 |
| 948.0 | 0 |
| 947.0 | 0 |
| 946.0 | 0 |
| 945.0 | 0 |
| 944.0 | 0 |
| 943.0 | 0 |
| 942.0 | 0 |
| 941.0 | 0 |
| 940.0 | 0 |
| 939.0 | 0 |
| 938.0 | 0 |
| 937.0 | 0 |
| 936.0 | 0 |
| 935.0 | 0 |
| 934.0 | 0 |
| 933.0 | 0 |
| 932.0 | 0 |
| 931.0 | 0 |
| 930.0 | 0 |
| 929.0 | 0 |
| 928.0 | 0 |
| 927.0 | 0 |
| 926.0 | 0 |
| 925.0 | 0 |
| 924.0 | 0 |
| 923.0 | 0 |
| 922.0 | 0 |
| 921.0 | 0 |
| 920.0 | 0 |
| 919.0 | 0 |
| 918.0 | 0 |
| 917.0 | 0 |
| 916.0 | 0 |
| 915.0 | 0 |
| 914.0 | 0 |
| 913.0 | 0 |
| 912.0 | 0 |
| 911.0 | 0 |
| 910.0 | 0 |
| 909.0 | 0 |
| 908.0 | 0 |
| 907.0 | 0 |
| 906.0 | 0 |
| 905.0 | 0 |
| 904.0 | 0 |
| 903.0 | 0 |
| 902.0 | 0 |
| 901.0 | 0 |
| 900.0 | 0 |
| 899.0 | 0 |
| 898.0 | 0 |
| 897.0 | 0 |
| 896.0 | 0 |
| 895.0 | 0 |
| 894.0 | 0 |
| 893.0 | 0 |
| 892.0 | 0 |
| 891.0 | 0 |
| 890.0 | 0 |
| 889.0 | 0 |
| 888.0 | 0 |
| 887.0 | 0 |
| 886.0 | 0 |
| 885.0 | 0 |
| 884.0 | 0 |
| 883.0 | 0 |
| 882.0 | 0 |
| 881.0 | 0 |
| 880.0 | 0 |
| 879.0 | 0 |
| 878.0 | 0 |
| 877.0 | 0 |
| 876.0 | 0 |
| 875.0 | 0 |
| 874.0 | 0 |
| 873.0 | 0 |
| 872.0 | 0 |
| 871.0 | 0 |
| 870.0 | 0 |
| 869.0 | 0 |
| 868.0 | 0 |
| 867.0 | 0 |
| 866.0 | 0 |
| 865.0 | 0 |
| 864.0 | 0.001 |
| 863.0 | 0 |
| 862.0 | 0 |
| 861.0 | 0 |
| 860.0 | 0.001 |
| 859.0 | 0.001 |
| 858.0 | 0 |
| 857.0 | 0.001 |
| 856.0 | 0.001 |
| 855.0 | 0.001 |
| 854.0 | 0.001 |
| 853.0 | 0.001 |
| 852.0 | 0.001 |
| 851.0 | 0.001 |
| 850.0 | 0.001 |
| 849.0 | 0.001 |
| 848.0 | 0.001 |
| 847.0 | 0.001 |
| 846.0 | 0.001 |
| 845.0 | 0.001 |
| 844.0 | 0.001 |
| 843.0 | 0.001 |
| 842.0 | 0.001 |
| 841.0 | 0.001 |
| 840.0 | 0.001 |
| 839.0 | 0.001 |
| 838.0 | 0.001 |
| 837.0 | 0.001 |
| 836.0 | 0.001 |
| 835.0 | 0.001 |
| 834.0 | 0.001 |
| 833.0 | 0.001 |
| 832.0 | 0.001 |
| 831.0 | 0.001 |
| 830.0 | 0.001 |
| 829.0 | 0.002 |
| 828.0 | 0.001 |
| 827.0 | 0.002 |
| 826.0 | 0.001 |
| 825.0 | 0.001 |
| 824.0 | 0.001 |
| 823.0 | 0.001 |
| 822.0 | 0.002 |
| 821.0 | 0.001 |
| 820.0 | 0.002 |
| 819.0 | 0.002 |
| 818.0 | 0.002 |
| 817.0 | 0.002 |
| 816.0 | 0.001 |
| 815.0 | 0.002 |
| 814.0 | 0.002 |
| 813.0 | 0.002 |
| 812.0 | 0.001 |
| 811.0 | 0.002 |
| 810.0 | 0.002 |
| 809.0 | 0.002 |
| 808.0 | 0.002 |
| 807.0 | 0.002 |
| 806.0 | 0.002 |
| 805.0 | 0.002 |
| 804.0 | 0.002 |
| 803.0 | 0.002 |
| 802.0 | 0.002 |
| 801.0 | 0.002 |
| 800.0 | 0.002 |
| 799.0 | 0 |
| 798.0 | 0 |
| 797.0 | 0 |
| 796.0 | 0 |
| 795.0 | 0 |
| 794.0 | 0 |
| 793.0 | 0 |
| 792.0 | 0 |
| 791.0 | 0 |
| 790.0 | 0 |
| 789.0 | 0 |
| 788.0 | 0 |
| 787.0 | 0 |
| 786.0 | 0 |
| 785.0 | 0 |
| 784.0 | 0 |
| 783.0 | 0 |
| 782.0 | 0 |
| 781.0 | 0 |
| 780.0 | 0 |
| 779.0 | 0 |
| 778.0 | 0 |
| 777.0 | 0 |
| 776.0 | 0 |
| 775.0 | 0 |
| 774.0 | 0 |
| 773.0 | 0 |
| 772.0 | 0 |
| 771.0 | 0 |
| 770.0 | 0 |
| 769.0 | 0 |
| 768.0 | 0 |
| 767.0 | 0 |
| 766.0 | 0 |
| 765.0 | 0 |
| 764.0 | 0 |
| 763.0 | 0 |
| 762.0 | 0 |
| 761.0 | 0 |
| 760.0 | 0 |
| 759.0 | 0 |
| 758.0 | 0 |
| 757.0 | 0 |
| 756.0 | 0 |
| 755.0 | 0 |
| 754.0 | 0 |
| 753.0 | 0 |
| 752.0 | 0 |
| 751.0 | 0 |
| 750.0 | 0 |
| 749.0 | 0 |
| 748.0 | 0 |
| 747.0 | 0 |
| 746.0 | 0 |
| 745.0 | 0 |
| 744.0 | 0 |
| 743.0 | 0 |
| 742.0 | 0 |
| 741.0 | 0 |
| 740.0 | 0 |
| 739.0 | 0 |
| 738.0 | 0 |
| 737.0 | 0 |
| 736.0 | 0 |
| 735.0 | 0 |
| 734.0 | 0 |
| 733.0 | 0 |
| 732.0 | 0 |
| 731.0 | 0 |
| 730.0 | 0 |
| 729.0 | 0 |
| 728.0 | 0 |
| 727.0 | 0 |
| 726.0 | 0 |
| 725.0 | 0 |
| 724.0 | 0 |
| 723.0 | 0 |
| 722.0 | 0 |
| 721.0 | 0 |
| 720.0 | 0 |
| 719.0 | 0 |
| 718.0 | 0 |
| 717.0 | 0 |
| 716.0 | 0 |
| 715.0 | 0 |
| 714.0 | 0 |
| 713.0 | 0 |
| 712.0 | 0 |
| 711.0 | 0.001 |
| 710.0 | 0.001 |
| 709.0 | 0.001 |
| 708.0 | 0.001 |
| 707.0 | 0.001 |
| 706.0 | 0.001 |
| 705.0 | 0.001 |
| 704.0 | 0.001 |
| 703.0 | 0.001 |
| 702.0 | 0.001 |
| 701.0 | 0.001 |
| 700.0 | 0.001 |
| 699.0 | 0.001 |
| 698.0 | 0.001 |
| 697.0 | 0.001 |
| 696.0 | 0.001 |
| 695.0 | 0.001 |
| 694.0 | 0.001 |
| 693.0 | 0.001 |
| 692.0 | 0.001 |
| 691.0 | 0.001 |
| 690.0 | 0.001 |
| 689.0 | 0.001 |
| 688.0 | 0.001 |
| 687.0 | 0.001 |
| 686.0 | 0.001 |
| 685.0 | 0.001 |
| 684.0 | 0.001 |
| 683.0 | 0.001 |
| 682.0 | 0.001 |
| 681.0 | 0.001 |
| 680.0 | 0 |
| 679.0 | 0 |
| 678.0 | 0 |
| 677.0 | 0 |
| 676.0 | 0 |
| 675.0 | 0 |
| 674.0 | 0 |
| 673.0 | 0 |
| 672.0 | 0 |
| 671.0 | 0 |
| 670.0 | 0 |
| 669.0 | 0 |
| 668.0 | 0 |
| 667.0 | 0 |
| 666.0 | 0 |
| 665.0 | 0 |
| 664.0 | 0 |
| 663.0 | 0 |
| 662.0 | 0 |
| 661.0 | 0 |
| 660.0 | 0 |
| 659.0 | 0 |
| 658.0 | 0 |
| 657.0 | 0 |
| 656.0 | 0 |
| 655.0 | 0 |
| 654.0 | 0 |
| 653.0 | 0 |
| 652.0 | 0 |
| 651.0 | 0 |
| 650.0 | 0 |
| 649.0 | 0 |
| 648.0 | 0 |
| 647.0 | 0 |
| 646.0 | 0 |
| 645.0 | 0 |
| 644.0 | 0 |
| 643.0 | 0 |
| 642.0 | 0 |
| 641.0 | 0 |
| 640.0 | 0 |
| 639.0 | 0 |
| 638.0 | 0 |
| 637.0 | 0 |
| 636.0 | 0 |
| 635.0 | 0 |
| 634.0 | 0 |
| 633.0 | 0 |
| 632.0 | 0 |
| 631.0 | 0 |
| 630.0 | 0 |
| 629.0 | 0 |
| 628.0 | 0 |
| 627.0 | 0 |
| 626.0 | 0 |
| 625.0 | 0 |
| 624.0 | 0 |
| 623.0 | 0 |
| 622.0 | 0 |
| 621.0 | 0 |
| 620.0 | 0 |
| 619.0 | 0 |
| 618.0 | 0 |
| 617.0 | 0 |
| 616.0 | 0 |
| 615.0 | 0 |
| 614.0 | 0 |
| 613.0 | 0 |
| 612.0 | 0 |
| 611.0 | 0 |
| 610.0 | 0 |
| 609.0 | 0 |
| 608.0 | 0 |
| 607.0 | 0 |
| 606.0 | 0 |
| 605.0 | 0 |
| 604.0 | 0 |
| 603.0 | 0 |
| 602.0 | 0 |
| 601.0 | 0 |
| 600.0 | 0 |
| 599.0 | 0 |
| 598.0 | 0.001 |
| 597.0 | 0.001 |
| 596.0 | 0.001 |
| 595.0 | 0.001 |
| 594.0 | 0.001 |
| 593.0 | 0.001 |
| 592.0 | 0.001 |
| 591.0 | 0.001 |
| 590.0 | 0.002 |
| 589.0 | 0.002 |
| 588.0 | 0.002 |
| 587.0 | 0.003 |
| 586.0 | 0.003 |
| 585.0 | 0.004 |
| 584.0 | 0.005 |
| 583.0 | 0.006 |
| 582.0 | 0.008 |
| 581.0 | 0.011 |
| 580.0 | 0.014 |
| 579.0 | 0.02 |
| 578.0 | 0.028 |
| 577.0 | 0.04 |
| 576.0 | 0.059 |
| 575.0 | 0.092 |
| 574.0 | 0.148 |
| 573.0 | 0.251 |
| 572.0 | 0.451 |
| 571.0 | 0.879 |
| 570.0 | 1.89 |
| 569.0 | 4.507 |
| 568.0 | 8.683 |
| 567.0 | 24.838 |
| 566.0 | 40.28 |
| 565.0 | 49.102 |
| 564.0 | 50.873 |
| 563.0 | 51.813 |
| 562.0 | 54.438 |
| 561.0 | 57.065 |
| 560.0 | 58.191 |
| 559.0 | 57.717 |
| 558.0 | 53.747 |
| 557.0 | 42.271 |
| 556.0 | 25.505 |
| 555.0 | 11.842 |
| 554.0 | 4.719 |
| 553.0 | 1.928 |
| 552.0 | 0.873 |
| 551.0 | 0.433 |
| 550.0 | 0.235 |
| 549.0 | 0.135 |
| 548.0 | 0.082 |
| 547.0 | 0.051 |
| 546.0 | 0.034 |
| 545.0 | 0.023 |
| 544.0 | 0.016 |
| 543.0 | 0.011 |
| 542.0 | 0.008 |
| 541.0 | 0.006 |
| 540.0 | 0.004 |
| 539.0 | 0.003 |
| 538.0 | 0.003 |
| 537.0 | 0.002 |
| 536.0 | 0.002 |
| 535.0 | 0.001 |
| 534.0 | 0.001 |
| 533.0 | 0.001 |
| 532.0 | 0.001 |
| 531.0 | 0 |
| 530.0 | 0 |
| 529.0 | 0 |
| 528.0 | 0 |
| 527.0 | 0 |
| 526.0 | 0 |
| 525.0 | 0 |
| 524.0 | 0 |
| 523.0 | 0 |
| 522.0 | 0 |
| 521.0 | 0 |
| 520.0 | 0 |
| 519.0 | 0 |
| 518.0 | 0 |
| 517.0 | 0 |
| 516.0 | 0 |
| 515.0 | 0 |
| 514.0 | 0 |
| 513.0 | 0 |
| 512.0 | 0 |
| 511.0 | 0 |
| 510.0 | 0 |
| 509.0 | 0 |
| 508.0 | 0 |
| 507.0 | 0 |
| 506.0 | 0 |
| 505.0 | 0 |
| 504.0 | 0 |
| 503.0 | 0 |
| 502.0 | 0 |
| 501.0 | 0 |
| 500.0 | 0 |
| 499.0 | 0 |
| 498.0 | 0 |
| 497.0 | 0 |
| 496.0 | 0 |
| 495.0 | 0 |
| 494.0 | 0 |
| 493.0 | 0 |
| 492.0 | 0 |
| 491.0 | 0 |
| 490.0 | 0 |
| 489.0 | 0 |
| 488.0 | 0 |
| 487.0 | 0 |
| 486.0 | 0 |
| 485.0 | 0 |
| 484.0 | 0 |
| 483.0 | 0 |
| 482.0 | 0 |
| 481.0 | 0 |
| 480.0 | 0 |
| 479.0 | 0 |
| 478.0 | 0 |
| 477.0 | 0 |
| 476.0 | 0 |
| 475.0 | 0 |
| 474.0 | 0 |
| 473.0 | 0 |
| 472.0 | 0 |
| 471.0 | 0 |
| 470.0 | 0 |
| 469.0 | 0 |
| 468.0 | 0 |
| 467.0 | 0 |
| 466.0 | 0 |
| 465.0 | 0 |
| 464.0 | 0 |
| 463.0 | 0 |
| 462.0 | 0 |
| 461.0 | 0 |
| 460.0 | 0 |
| 459.0 | 0 |
| 458.0 | 0 |
| 457.0 | 0 |
| 456.0 | 0 |
| 455.0 | 0 |
| 454.0 | 0 |
| 453.0 | 0 |
| 452.0 | 0 |
| 451.0 | 0 |
| 450.0 | 0 |
| 449.0 | 0 |
| 448.0 | 0 |
| 447.0 | 0 |
| 446.0 | 0 |
| 445.0 | 0 |
| 444.0 | 0 |
| 443.0 | 0 |
| 442.0 | 0 |
| 441.0 | 0 |
| 440.0 | 0 |
| 439.0 | 0 |
| 438.0 | 0 |
| 437.0 | 0 |
| 436.0 | 0 |
| 435.0 | 0 |
| 434.0 | 0 |
| 433.0 | 0 |
| 432.0 | 0 |
| 431.0 | 0 |
| 430.0 | 0 |
| 429.0 | 0 |
| 428.0 | 0 |
| 427.0 | 0 |
| 426.0 | 0 |
| 425.0 | 0 |
| 424.0 | 0 |
| 423.0 | 0 |
| 422.0 | 0 |
| 421.0 | 0 |
| 420.0 | 0 |
| 419.0 | 0 |
| 418.0 | 0 |
| 417.0 | 0 |
| 416.0 | 0 |
| 415.0 | 0 |
| 414.0 | 0 |
| 413.0 | 0 |
| 412.0 | 0 |
| 411.0 | 0 |
| 410.0 | 0 |
| 409.0 | 0 |
| 408.0 | 0 |
| 407.0 | 0 |
| 406.0 | 0 |
| 405.0 | 0 |
| 404.0 | 0 |
| 403.0 | 0 |
| 402.0 | 0 |
| 401.0 | 0 |
| 400.0 | 0 |
| 399.0 | 0 |
| 398.0 | 0 |
| 397.0 | 0 |
| 396.0 | 0 |
| 395.0 | 0 |
| 394.0 | 0 |
| 393.0 | 0 |
| 392.0 | 0 |
| 391.0 | 0 |
| 390.0 | 0 |
| 389.0 | 0 |
| 388.0 | 0 |
| 387.0 | 0 |
| 386.0 | 0 |
| 385.0 | 0 |
| 384.0 | 0 |
| 383.0 | 0 |
| 382.0 | 0 |
| 381.0 | 0 |
| 380.0 | 0 |
| 379.0 | 0 |
| 378.0 | 0 |
| 377.0 | 0 |
| 376.0 | 0 |
| 375.0 | 0 |
| 374.0 | 0 |
| 373.0 | 0 |
| 372.0 | 0 |
| 371.0 | 0 |
| 370.0 | 0 |
| 369.0 | 0 |
| 368.0 | 0 |
| 367.0 | 0 |
| 366.0 | 0 |
| 365.0 | 0 |
| 364.0 | 0 |
| 363.0 | 0 |
| 362.0 | 0 |
| 361.0 | 0 |
| 360.0 | 0 |
| 359.0 | 0 |
| 358.0 | 0 |
| 357.0 | 0 |
| 356.0 | 0 |
| 355.0 | 0 |
| 354.0 | 0 |
| 353.0 | 0 |
| 352.0 | 0 |
| 351.0 | 0 |
| 350.0 | 0 |
| 349.0 | 0 |
| 348.0 | 0 |
| 347.0 | 0 |
| 346.0 | 0 |
| 345.0 | 0 |
| 344.0 | 0 |
| 343.0 | 0 |
| 342.0 | 0 |
| 341.0 | 0 |
| 340.0 | 0 |
| 339.0 | 0 |
| 338.0 | 0 |
| 337.0 | 0 |
| 336.0 | 0 |
| 335.0 | 0 |
| 334.0 | 0 |
| 333.0 | 0 |
| 332.0 | 0 |
| 331.0 | 0 |
| 330.0 | 0 |
| 329.0 | 0 |
| 328.0 | 0 |
| 327.0 | 0 |
| 326.0 | 0 |
| 325.0 | 0 |
| 324.0 | 0 |
| 323.0 | 0 |
| 322.0 | 0 |
| 321.0 | 0 |
| 320.0 | 0 |
| 319.0 | 0 |
| 318.0 | 0 |
| 317.0 | 0 |
| 316.0 | 0 |
| 315.0 | 0 |
| 314.0 | 0 |
| 313.0 | 0 |
| 312.0 | 0 |
| 311.0 | 0 |
| 310.0 | 0 |
| 309.0 | 0 |
| 308.0 | 0 |
| 307.0 | 0 |
| 306.0 | 0 |
| 305.0 | 0 |
| 304.0 | 0 |
| 303.0 | 0 |
| 302.0 | 0 |
| 301.0 | 0 |
| 300.0 | 0 |
| 299.0 | 0 |
| 298.0 | 0 |
| 297.0 | 0 |
| 296.0 | 0 |
| 295.0 | 0 |
| 294.0 | 0 |
| 293.0 | 0 |
| 292.0 | 0 |
| 291.0 | 0 |
| 290.0 | 0 |
| 289.0 | 0 |
| 288.0 | 0 |
| 287.0 | 0 |
| 286.0 | 0 |
| 285.0 | 0 |
| 284.0 | 0 |
| 283.0 | 0 |
| 282.0 | 0 |
| 281.0 | 0 |
| 280.0 | 0 |
| 279.0 | 0 |
| 278.0 | 0 |
| 277.0 | 0 |
| 276.0 | 0 |
| 275.0 | 0 |
| 274.0 | 0 |
| 273.0 | 0 |
| 272.0 | 0 |
| 271.0 | 0 |
| 270.0 | 0 |
| 269.0 | 0 |
| 268.0 | 0 |
| 267.0 | 0 |
| 266.0 | 0 |
| 265.0 | 0 |
| 264.0 | 0 |
| 263.0 | 0 |
| 262.0 | 0 |
| 261.0 | 0 |
| 260.0 | 0 |
| 259.0 | 0 |
| 258.0 | 0 |
| 257.0 | 0 |
| 256.0 | 0 |
| 255.0 | 0 |
| 254.0 | 0 |
| 253.0 | 0 |
| 252.0 | 0 |
| 251.0 | 0 |
| 250.0 | 0 |
| 249.0 | 0 |
| 248.0 | 0 |
| 247.0 | 0 |
| 246.0 | 0 |
| 245.0 | 0 |
| 244.0 | 0 |
| 243.0 | 0 |
| 242.0 | 0 |
| 241.0 | 0 |
| 240.0 | 0 |
| 239.0 | 0 |
| 238.0 | 0 |
| 237.0 | 0 |
| 236.0 | 0 |
| 235.0 | 0 |
| 234.0 | 0 |
| 233.0 | 0 |
| 232.0 | 0 |
| 231.0 | 0 |
| 230.0 | 0 |
| 229.0 | 0 |
| 228.0 | 0 |
| 227.0 | 0 |
| 226.0 | 0 |
| 225.0 | 0 |
| 224.0 | 0 |
| 223.0 | 0 |
| 222.0 | 0 |
| 221.0 | 0 |
| 220.0 | 0 |
| 219.0 | 0 |
| 218.0 | 0 |
| 217.0 | 0 |
| 216.0 | 0 |
| 215.0 | 0 |
| 214.0 | 0 |
| 213.0 | 0 |
| 212.0 | 0 |
| 211.0 | 0 |
| 210.0 | 0 |
| 209.0 | 0 |
| 208.0 | 0 |
| 207.0 | 0 |
| 206.0 | 0 |
| 205.0 | 0 |
| 204.0 | 0 |
| 203.0 | 0 |
| 202.0 | 0 |
| 201.0 | 0 |